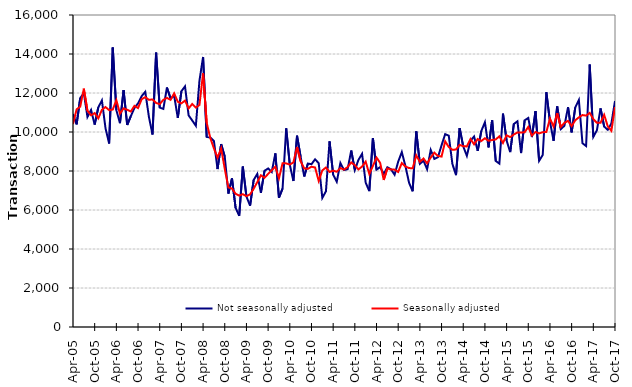
| Category | Not seasonally adjusted | Seasonally adjusted |
|---|---|---|
| 2005-04-01 | 10920 | 10410 |
| 2005-05-01 | 10390 | 11160 |
| 2005-06-01 | 11740 | 11300 |
| 2005-07-01 | 12000 | 12220 |
| 2005-08-01 | 10770 | 11090 |
| 2005-09-01 | 11130 | 10860 |
| 2005-10-01 | 10380 | 10970 |
| 2005-11-01 | 11260 | 10700 |
| 2005-12-01 | 11620 | 11140 |
| 2006-01-01 | 10190 | 11280 |
| 2006-02-01 | 9410 | 11120 |
| 2006-03-01 | 14330 | 11150 |
| 2006-04-01 | 11120 | 11630 |
| 2006-05-01 | 10450 | 10940 |
| 2006-06-01 | 12150 | 11210 |
| 2006-07-01 | 10360 | 11140 |
| 2006-08-01 | 10810 | 11050 |
| 2006-09-01 | 11230 | 11340 |
| 2006-10-01 | 11470 | 11230 |
| 2006-11-01 | 11840 | 11680 |
| 2006-12-01 | 12060 | 11790 |
| 2007-01-01 | 10790 | 11650 |
| 2007-02-01 | 9870 | 11670 |
| 2007-03-01 | 14070 | 11490 |
| 2007-04-01 | 11250 | 11430 |
| 2007-05-01 | 11180 | 11650 |
| 2007-06-01 | 12280 | 11750 |
| 2007-07-01 | 11720 | 11650 |
| 2007-08-01 | 11860 | 11980 |
| 2007-09-01 | 10720 | 11550 |
| 2007-10-01 | 12090 | 11470 |
| 2007-11-01 | 12340 | 11610 |
| 2007-12-01 | 10850 | 11210 |
| 2008-01-01 | 10590 | 11440 |
| 2008-02-01 | 10320 | 11250 |
| 2008-03-01 | 12640 | 11390 |
| 2008-04-01 | 13850 | 13010 |
| 2008-05-01 | 9750 | 10470 |
| 2008-06-01 | 9720 | 9690 |
| 2008-07-01 | 9540 | 9160 |
| 2008-08-01 | 8100 | 8680 |
| 2008-09-01 | 9380 | 9160 |
| 2008-10-01 | 8740 | 8110 |
| 2008-11-01 | 6840 | 7160 |
| 2008-12-01 | 7620 | 7100 |
| 2009-01-01 | 6110 | 6830 |
| 2009-02-01 | 5700 | 6740 |
| 2009-03-01 | 8230 | 6810 |
| 2009-04-01 | 6690 | 6710 |
| 2009-05-01 | 6220 | 6800 |
| 2009-06-01 | 7540 | 7090 |
| 2009-07-01 | 7850 | 7430 |
| 2009-08-01 | 6880 | 7780 |
| 2009-09-01 | 8010 | 7650 |
| 2009-10-01 | 8130 | 7850 |
| 2009-11-01 | 7950 | 8040 |
| 2009-12-01 | 8900 | 8220 |
| 2010-01-01 | 6630 | 7630 |
| 2010-02-01 | 7100 | 8400 |
| 2010-03-01 | 10190 | 8390 |
| 2010-04-01 | 8320 | 8330 |
| 2010-05-01 | 7490 | 8440 |
| 2010-06-01 | 9810 | 9230 |
| 2010-07-01 | 8720 | 8500 |
| 2010-08-01 | 7720 | 8130 |
| 2010-09-01 | 8380 | 8110 |
| 2010-10-01 | 8350 | 8220 |
| 2010-11-01 | 8600 | 8180 |
| 2010-12-01 | 8400 | 7490 |
| 2011-01-01 | 6620 | 8030 |
| 2011-02-01 | 6960 | 8180 |
| 2011-03-01 | 9520 | 7950 |
| 2011-04-01 | 7810 | 8020 |
| 2011-05-01 | 7450 | 7960 |
| 2011-06-01 | 8410 | 8150 |
| 2011-07-01 | 8050 | 8070 |
| 2011-08-01 | 8090 | 8200 |
| 2011-09-01 | 9050 | 8440 |
| 2011-10-01 | 8050 | 8300 |
| 2011-11-01 | 8570 | 8080 |
| 2011-12-01 | 8880 | 8230 |
| 2012-01-01 | 7400 | 8480 |
| 2012-02-01 | 6970 | 7850 |
| 2012-03-01 | 9690 | 8260 |
| 2012-04-01 | 8070 | 8690 |
| 2012-05-01 | 8200 | 8420 |
| 2012-06-01 | 7850 | 7540 |
| 2012-07-01 | 8190 | 8130 |
| 2012-08-01 | 8090 | 8080 |
| 2012-09-01 | 7810 | 8070 |
| 2012-10-01 | 8480 | 7950 |
| 2012-11-01 | 8970 | 8410 |
| 2012-12-01 | 8250 | 8230 |
| 2013-01-01 | 7400 | 8150 |
| 2013-02-01 | 6960 | 8140 |
| 2013-03-01 | 10030 | 8800 |
| 2013-04-01 | 8370 | 8470 |
| 2013-05-01 | 8530 | 8640 |
| 2013-06-01 | 8090 | 8390 |
| 2013-07-01 | 9080 | 8690 |
| 2013-08-01 | 8620 | 8940 |
| 2013-09-01 | 8710 | 8770 |
| 2013-10-01 | 9320 | 8740 |
| 2013-11-01 | 9890 | 9520 |
| 2013-12-01 | 9810 | 9230 |
| 2014-01-01 | 8360 | 9090 |
| 2014-02-01 | 7790 | 9100 |
| 2014-03-01 | 10200 | 9340 |
| 2014-04-01 | 9260 | 9270 |
| 2014-05-01 | 8780 | 9260 |
| 2014-06-01 | 9550 | 9640 |
| 2014-07-01 | 9770 | 9370 |
| 2014-08-01 | 9030 | 9640 |
| 2014-09-01 | 10050 | 9540 |
| 2014-10-01 | 10500 | 9680 |
| 2014-11-01 | 9210 | 9550 |
| 2014-12-01 | 10610 | 9590 |
| 2015-01-01 | 8510 | 9620 |
| 2015-02-01 | 8380 | 9780 |
| 2015-03-01 | 10940 | 9440 |
| 2015-04-01 | 9560 | 9830 |
| 2015-05-01 | 8970 | 9740 |
| 2015-06-01 | 10410 | 9870 |
| 2015-07-01 | 10550 | 9980 |
| 2015-08-01 | 8920 | 9970 |
| 2015-09-01 | 10600 | 9990 |
| 2015-10-01 | 10720 | 10260 |
| 2015-11-01 | 9740 | 9820 |
| 2015-12-01 | 11070 | 10000 |
| 2016-01-01 | 8520 | 9930 |
| 2016-02-01 | 8820 | 9990 |
| 2016-03-01 | 12040 | 10000 |
| 2016-04-01 | 10530 | 10690 |
| 2016-05-01 | 9550 | 10280 |
| 2016-06-01 | 11310 | 10970 |
| 2016-07-01 | 10150 | 10260 |
| 2016-08-01 | 10320 | 10470 |
| 2016-09-01 | 11270 | 10570 |
| 2016-10-01 | 9980 | 10300 |
| 2016-11-01 | 11260 | 10600 |
| 2016-12-01 | 11640 | 10750 |
| 2017-01-01 | 9420 | 10870 |
| 2017-02-01 | 9280 | 10840 |
| 2017-03-01 | 13460 | 10980 |
| 2017-04-01 | 9750 | 10660 |
| 2017-05-01 | 10090 | 10470 |
| 2017-06-01 | 11210 | 10470 |
| 2017-07-01 | 10280 | 10880 |
| 2017-08-01 | 10110 | 10290 |
| 2017-09-01 | 10440 | 10060 |
| 2017-10-01 | 11590 | 11280 |